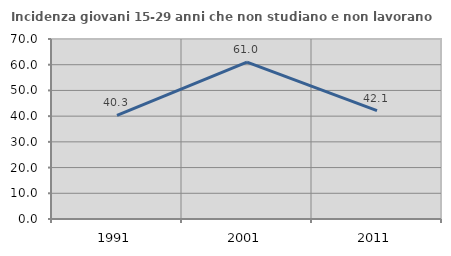
| Category | Incidenza giovani 15-29 anni che non studiano e non lavorano  |
|---|---|
| 1991.0 | 40.301 |
| 2001.0 | 61.037 |
| 2011.0 | 42.115 |